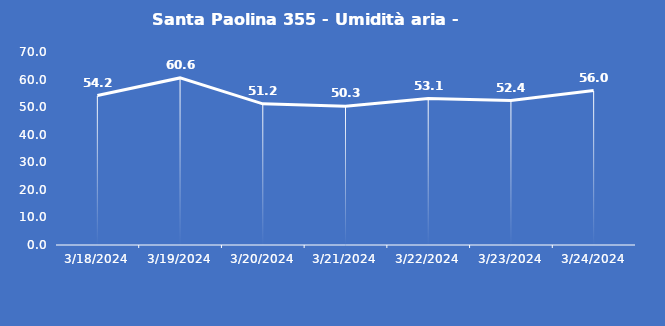
| Category | Santa Paolina 355 - Umidità aria - Grezzo (%) |
|---|---|
| 3/18/24 | 54.2 |
| 3/19/24 | 60.6 |
| 3/20/24 | 51.2 |
| 3/21/24 | 50.3 |
| 3/22/24 | 53.1 |
| 3/23/24 | 52.4 |
| 3/24/24 | 56 |